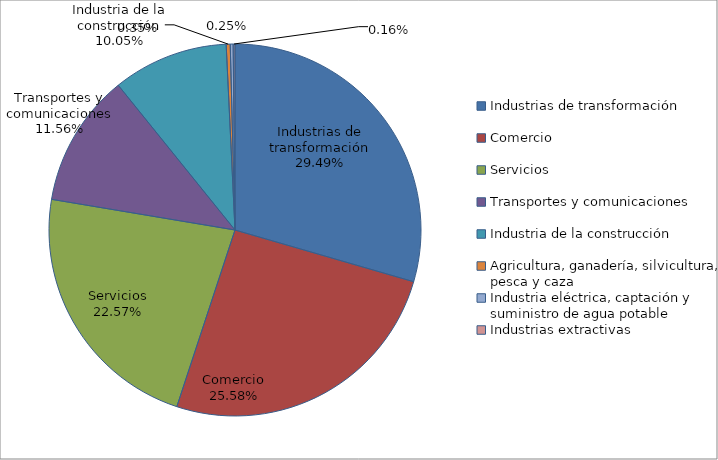
| Category | Series 0 |
|---|---|
| Industrias de transformación | 29173 |
| Comercio | 25308 |
| Servicios | 22333 |
| Transportes y comunicaciones | 11436 |
| Industria de la construcción | 9940 |
| Agricultura, ganadería, silvicultura, pesca y caza | 343 |
| Industria eléctrica, captación y suministro de agua potable | 251 |
| Industrias extractivas | 155 |